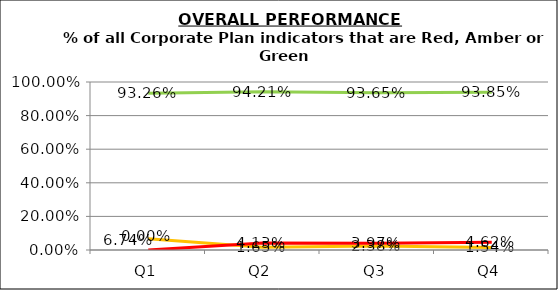
| Category | Green | Amber | Red |
|---|---|---|---|
| Q1 | 0.933 | 0.067 | 0 |
| Q2 | 0.942 | 0.017 | 0.041 |
| Q3 | 0.937 | 0.024 | 0.04 |
| Q4 | 0.938 | 0.015 | 0.046 |